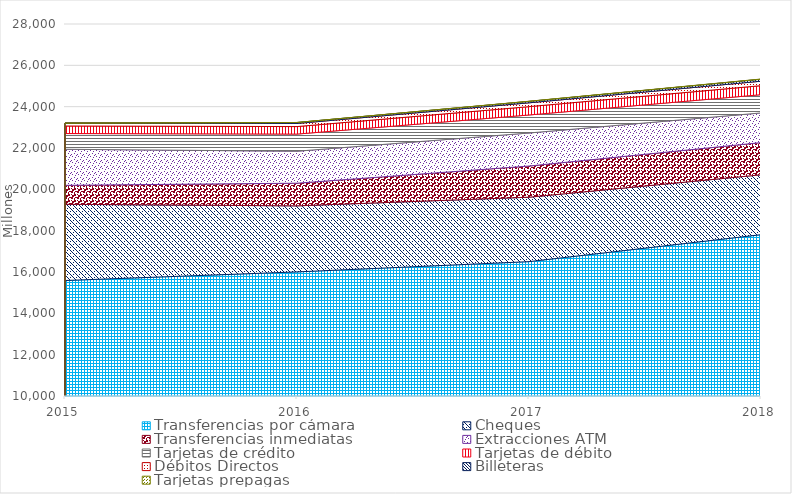
| Category | Transferencias por cámara | Cheques | Transferencias inmediatas | Extracciones ATM | Tarjetas de crédito | Tarjetas de débito | Débitos Directos | Billeteras | Tarjetas prepagas |
|---|---|---|---|---|---|---|---|---|---|
| 2015.0 | 15588.441 | 3687.441 | 918.201 | 1744.49 | 761.503 | 364.118 | 139.24 | 0 | 0 |
| 2016.0 | 16004.864 | 3195.884 | 1096.137 | 1547.44 | 828.933 | 363.605 | 149.902 | 47.165 | 0 |
| 2017.0 | 16501.742 | 3117.674 | 1507.742 | 1599.077 | 871.295 | 403.304 | 185.125 | 69.428 | 6.817 |
| 2018.0 | 17806.199 | 2897.745 | 1557.19 | 1435.908 | 882.276 | 436.992 | 215.68 | 95.194 | 10.044 |